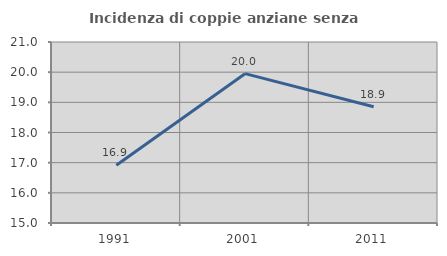
| Category | Incidenza di coppie anziane senza figli  |
|---|---|
| 1991.0 | 16.916 |
| 2001.0 | 19.95 |
| 2011.0 | 18.852 |